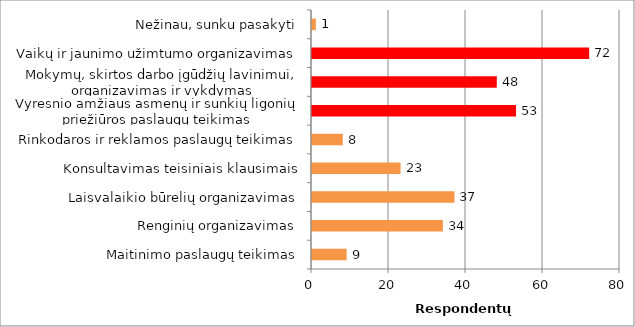
| Category | Series 0 |
|---|---|
| Maitinimo paslaugų teikimas | 9 |
| Renginių organizavimas | 34 |
| Laisvalaikio būrelių organizavimas | 37 |
| Konsultavimas teisiniais klausimais | 23 |
| Rinkodaros ir reklamos paslaugų teikimas | 8 |
| Vyresnio amžiaus asmenų ir sunkių ligonių priežiūros paslaugų teikimas | 53 |
| Mokymų, skirtos darbo įgūdžių lavinimui, organizavimas ir vykdymas | 48 |
| Vaikų ir jaunimo užimtumo organizavimas | 72 |
| Nežinau, sunku pasakyti | 1 |